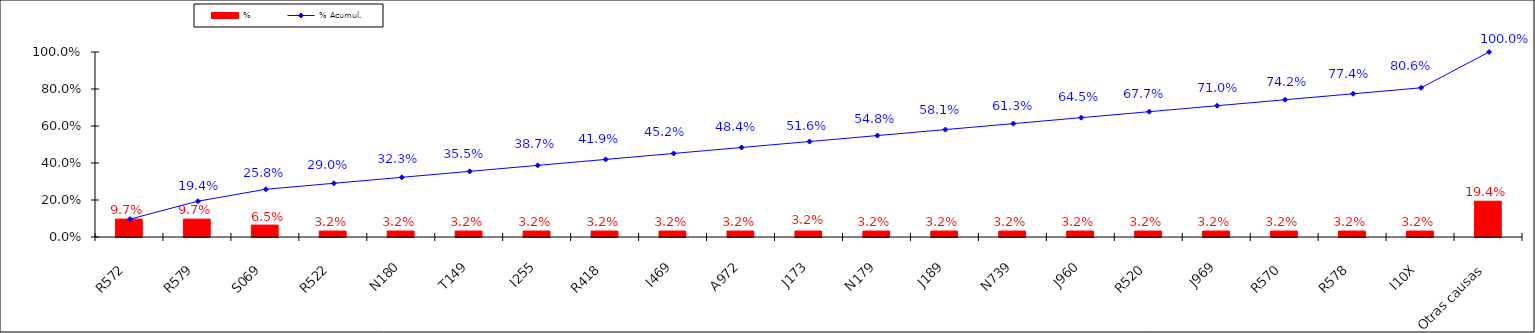
| Category | % |
|---|---|
| R572 | 0.097 |
| R579 | 0.097 |
| S069 | 0.065 |
| R522 | 0.032 |
| N180 | 0.032 |
| T149 | 0.032 |
| I255 | 0.032 |
| R418 | 0.032 |
| I469 | 0.032 |
| A972 | 0.032 |
| J173 | 0.032 |
| N179 | 0.032 |
| J189 | 0.032 |
| N739 | 0.032 |
| J960 | 0.032 |
| R520 | 0.032 |
| J969 | 0.032 |
| R570 | 0.032 |
| R578 | 0.032 |
| I10X | 0.032 |
| Otras causas | 0.194 |